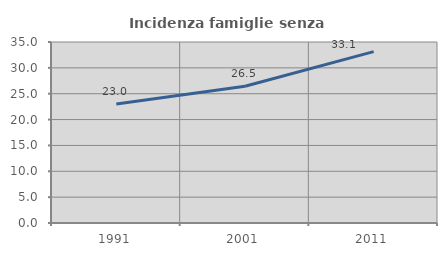
| Category | Incidenza famiglie senza nuclei |
|---|---|
| 1991.0 | 23.03 |
| 2001.0 | 26.457 |
| 2011.0 | 33.135 |